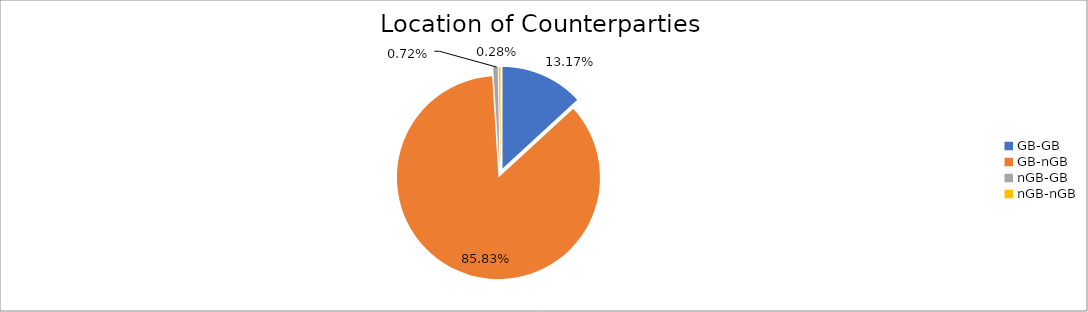
| Category | Series 0 |
|---|---|
| GB-GB | 1503668.399 |
| GB-nGB | 9796602.54 |
| nGB-GB | 82204.379 |
| nGB-nGB | 31497.702 |